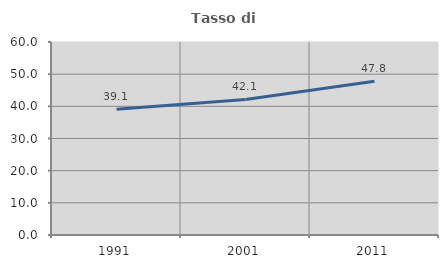
| Category | Tasso di occupazione   |
|---|---|
| 1991.0 | 39.106 |
| 2001.0 | 42.148 |
| 2011.0 | 47.765 |